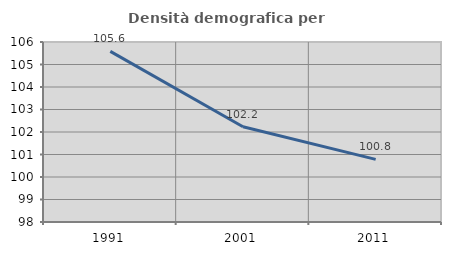
| Category | Densità demografica |
|---|---|
| 1991.0 | 105.582 |
| 2001.0 | 102.236 |
| 2011.0 | 100.785 |